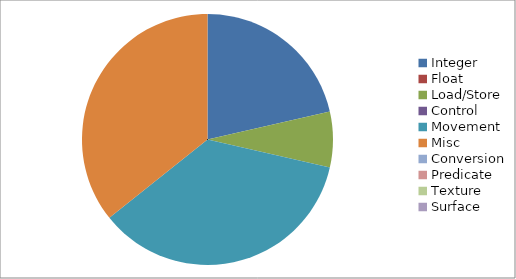
| Category | Series 0 |
|---|---|
| Integer | 3 |
| Float | 0 |
| Load/Store | 1 |
| Control | 0 |
| Movement | 5 |
| Misc | 5 |
| Conversion | 0 |
| Predicate | 0 |
| Texture | 0 |
| Surface | 0 |